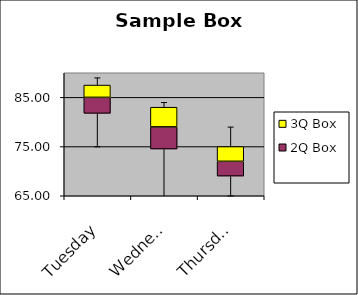
| Category | Series 0 | 2Q Box | 3Q Box |
|---|---|---|---|
| Tuesday | 81.75 | 3.25 | 2.5 |
| Wednesday | 74.5 | 4.5 | 4 |
| Thursday | 69 | 3 | 3 |